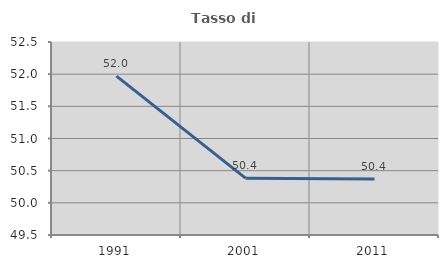
| Category | Tasso di occupazione   |
|---|---|
| 1991.0 | 51.97 |
| 2001.0 | 50.383 |
| 2011.0 | 50.371 |